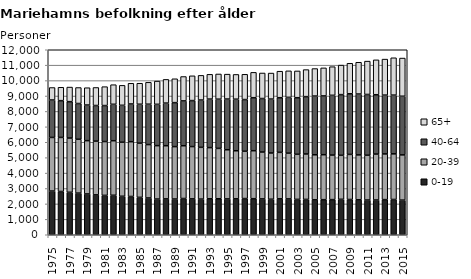
| Category | 0-19 | 20-39 | 40-64 | 65+ |
|---|---|---|---|---|
| 1975.0 | 2835 | 3478 | 2428 | 809 |
| 1976.0 | 2806 | 3508 | 2384 | 868 |
| 1977.0 | 2755 | 3517 | 2361 | 946 |
| 1978.0 | 2700 | 3494 | 2319 | 1037 |
| 1979.0 | 2648 | 3456 | 2311 | 1123 |
| 1980.0 | 2588 | 3483 | 2313 | 1169 |
| 1981.0 | 2555 | 3491 | 2334 | 1226 |
| 1982.0 | 2562 | 3538 | 2362 | 1271 |
| 1983.0 | 2497 | 3505 | 2394 | 1295 |
| 1984.0 | 2483 | 3554 | 2447 | 1340 |
| 1985.0 | 2426 | 3515 | 2525 | 1363 |
| 1986.0 | 2385 | 3464 | 2619 | 1420 |
| 1987.0 | 2315 | 3466 | 2679 | 1506 |
| 1988.0 | 2327 | 3450 | 2762 | 1538 |
| 1989.0 | 2317 | 3400 | 2853 | 1547 |
| 1990.0 | 2351 | 3424 | 2907 | 1581 |
| 1991.0 | 2327 | 3393 | 2984 | 1606 |
| 1992.0 | 2312 | 3359 | 3067 | 1600 |
| 1993.0 | 2333 | 3320 | 3147 | 1606 |
| 1994.0 | 2335 | 3267 | 3192 | 1635 |
| 1995.0 | 2323 | 3191 | 3288 | 1616 |
| 1996.0 | 2330 | 3118 | 3345 | 1606 |
| 1997.0 | 2348 | 3070 | 3351 | 1639 |
| 1998.0 | 2340 | 3112 | 3438 | 1644 |
| 1999.0 | 2324 | 3042 | 3470 | 1656 |
| 2000.0 | 2304 | 2999 | 3498 | 1687 |
| 2001.0 | 2331 | 3014 | 3544 | 1720 |
| 2002.0 | 2326 | 2967 | 3619 | 1720 |
| 2003.0 | 2294 | 2926 | 3670 | 1736 |
| 2004.0 | 2293 | 2946 | 3720 | 1753 |
| 2005.0 | 2267 | 2921 | 3808 | 1784 |
| 2006.0 | 2276 | 2917 | 3813 | 1818 |
| 2007.0 | 2279 | 2889 | 3876 | 1858 |
| 2008.0 | 2300 | 2854 | 3936 | 1915 |
| 2009.0 | 2287 | 2925 | 3932 | 1979 |
| 2010.0 | 2267 | 2913 | 3948 | 2062 |
| 2011.0 | 2253 | 2906 | 3941 | 2163 |
| 2012.0 | 2255 | 2978 | 3850 | 2263 |
| 2013.0 | 2279 | 2963 | 3816 | 2335 |
| 2014.0 | 2288 | 2959 | 3810 | 2423 |
| 2015.0 | 2246 | 2935 | 3803 | 2477 |